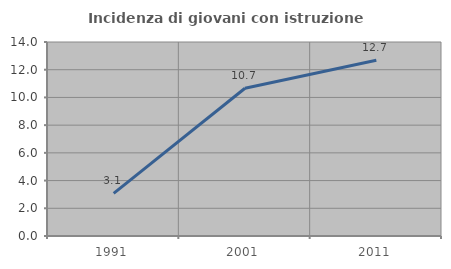
| Category | Incidenza di giovani con istruzione universitaria |
|---|---|
| 1991.0 | 3.077 |
| 2001.0 | 10.659 |
| 2011.0 | 12.687 |